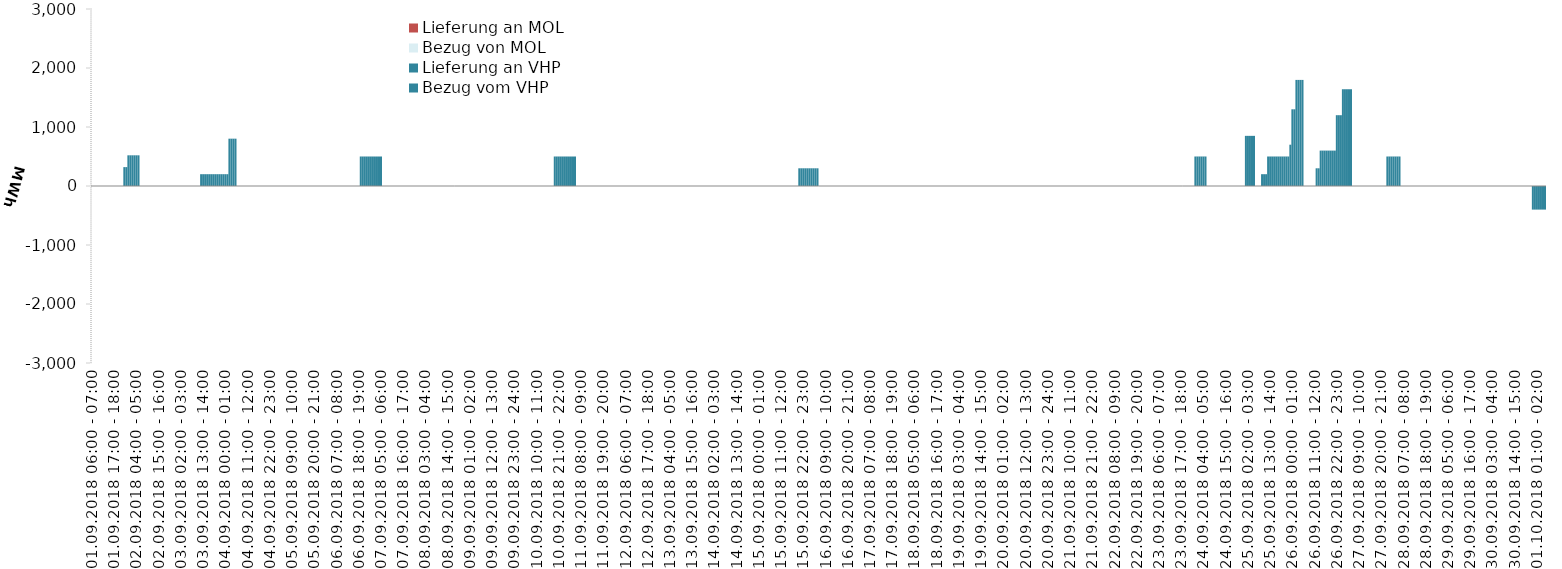
| Category | Bezug vom VHP | Lieferung an VHP | Bezug von MOL | Lieferung an MOL |
|---|---|---|---|---|
| 01.09.2018 06:00 - 07:00 | 0 | 0 | 0 | 0 |
| 01.09.2018 07:00 - 08:00 | 0 | 0 | 0 | 0 |
| 01.09.2018 08:00 - 09:00 | 0 | 0 | 0 | 0 |
| 01.09.2018 09:00 - 10:00 | 0 | 0 | 0 | 0 |
| 01.09.2018 10:00 - 11:00 | 0 | 0 | 0 | 0 |
| 01.09.2018 11:00 - 12:00 | 0 | 0 | 0 | 0 |
| 01.09.2018 12:00 - 13:00 | 0 | 0 | 0 | 0 |
| 01.09.2018 13:00 - 14:00 | 0 | 0 | 0 | 0 |
| 01.09.2018 14:00 - 15:00 | 0 | 0 | 0 | 0 |
| 01.09.2018 15:00 - 16:00 | 0 | 0 | 0 | 0 |
| 01.09.2018 16:00 - 17:00 | 0 | 0 | 0 | 0 |
| 01.09.2018 17:00 - 18:00 | 0 | 0 | 0 | 0 |
| 01.09.2018 18:00 - 19:00 | 0 | 0 | 0 | 0 |
| 01.09.2018 19:00 - 20:00 | 0 | 0 | 0 | 0 |
| 01.09.2018 20:00 - 21:00 | 0 | 0 | 0 | 0 |
| 01.09.2018 21:00 - 22:00 | 0 | 0 | 0 | 0 |
| 01.09.2018 22:00 - 23:00 | 320 | 0 | 0 | 0 |
| 01.09.2018 23:00 - 24:00 | 320 | 0 | 0 | 0 |
| 02.09.2018 00:00 - 01:00 | 520 | 0 | 0 | 0 |
| 02.09.2018 01:00 - 02:00 | 520 | 0 | 0 | 0 |
| 02.09.2018 02:00 - 03:00 | 520 | 0 | 0 | 0 |
| 02.09.2018 03:00 - 04:00 | 520 | 0 | 0 | 0 |
| 02.09.2018 04:00 - 05:00 | 520 | 0 | 0 | 0 |
| 02.09.2018 05:00 - 06:00 | 520 | 0 | 0 | 0 |
| 02.09.2018 06:00 - 07:00 | 0 | 0 | 0 | 0 |
| 02.09.2018 07:00 - 08:00 | 0 | 0 | 0 | 0 |
| 02.09.2018 08:00 - 09:00 | 0 | 0 | 0 | 0 |
| 02.09.2018 09:00 - 10:00 | 0 | 0 | 0 | 0 |
| 02.09.2018 10:00 - 11:00 | 0 | 0 | 0 | 0 |
| 02.09.2018 11:00 - 12:00 | 0 | 0 | 0 | 0 |
| 02.09.2018 12:00 - 13:00 | 0 | 0 | 0 | 0 |
| 02.09.2018 13:00 - 14:00 | 0 | 0 | 0 | 0 |
| 02.09.2018 14:00 - 15:00 | 0 | 0 | 0 | 0 |
| 02.09.2018 15:00 - 16:00 | 0 | 0 | 0 | 0 |
| 02.09.2018 16:00 - 17:00 | 0 | 0 | 0 | 0 |
| 02.09.2018 17:00 - 18:00 | 0 | 0 | 0 | 0 |
| 02.09.2018 18:00 - 19:00 | 0 | 0 | 0 | 0 |
| 02.09.2018 19:00 - 20:00 | 0 | 0 | 0 | 0 |
| 02.09.2018 20:00 - 21:00 | 0 | 0 | 0 | 0 |
| 02.09.2018 21:00 - 22:00 | 0 | 0 | 0 | 0 |
| 02.09.2018 22:00 - 23:00 | 0 | 0 | 0 | 0 |
| 02.09.2018 23:00 - 24:00 | 0 | 0 | 0 | 0 |
| 03.09.2018 00:00 - 01:00 | 0 | 0 | 0 | 0 |
| 03.09.2018 01:00 - 02:00 | 0 | 0 | 0 | 0 |
| 03.09.2018 02:00 - 03:00 | 0 | 0 | 0 | 0 |
| 03.09.2018 03:00 - 04:00 | 0 | 0 | 0 | 0 |
| 03.09.2018 04:00 - 05:00 | 0 | 0 | 0 | 0 |
| 03.09.2018 05:00 - 06:00 | 0 | 0 | 0 | 0 |
| 03.09.2018 06:00 - 07:00 | 0 | 0 | 0 | 0 |
| 03.09.2018 07:00 - 08:00 | 0 | 0 | 0 | 0 |
| 03.09.2018 08:00 - 09:00 | 0 | 0 | 0 | 0 |
| 03.09.2018 09:00 - 10:00 | 0 | 0 | 0 | 0 |
| 03.09.2018 10:00 - 11:00 | 0 | 0 | 0 | 0 |
| 03.09.2018 11:00 - 12:00 | 0 | 0 | 0 | 0 |
| 03.09.2018 12:00 - 13:00 | 200 | 0 | 0 | 0 |
| 03.09.2018 13:00 - 14:00 | 200 | 0 | 0 | 0 |
| 03.09.2018 14:00 - 15:00 | 200 | 0 | 0 | 0 |
| 03.09.2018 15:00 - 16:00 | 200 | 0 | 0 | 0 |
| 03.09.2018 16:00 - 17:00 | 200 | 0 | 0 | 0 |
| 03.09.2018 17:00 - 18:00 | 200 | 0 | 0 | 0 |
| 03.09.2018 18:00 - 19:00 | 200 | 0 | 0 | 0 |
| 03.09.2018 19:00 - 20:00 | 200 | 0 | 0 | 0 |
| 03.09.2018 20:00 - 21:00 | 200 | 0 | 0 | 0 |
| 03.09.2018 21:00 - 22:00 | 200 | 0 | 0 | 0 |
| 03.09.2018 22:00 - 23:00 | 200 | 0 | 0 | 0 |
| 03.09.2018 23:00 - 24:00 | 200 | 0 | 0 | 0 |
| 04.09.2018 00:00 - 01:00 | 200 | 0 | 0 | 0 |
| 04.09.2018 01:00 - 02:00 | 200 | 0 | 0 | 0 |
| 04.09.2018 02:00 - 03:00 | 802 | 0 | 0 | 0 |
| 04.09.2018 03:00 - 04:00 | 802 | 0 | 0 | 0 |
| 04.09.2018 04:00 - 05:00 | 802 | 0 | 0 | 0 |
| 04.09.2018 05:00 - 06:00 | 802 | 0 | 0 | 0 |
| 04.09.2018 06:00 - 07:00 | 0 | 0 | 0 | 0 |
| 04.09.2018 07:00 - 08:00 | 0 | 0 | 0 | 0 |
| 04.09.2018 08:00 - 09:00 | 0 | 0 | 0 | 0 |
| 04.09.2018 09:00 - 10:00 | 0 | 0 | 0 | 0 |
| 04.09.2018 10:00 - 11:00 | 0 | 0 | 0 | 0 |
| 04.09.2018 11:00 - 12:00 | 0 | 0 | 0 | 0 |
| 04.09.2018 12:00 - 13:00 | 0 | 0 | 0 | 0 |
| 04.09.2018 13:00 - 14:00 | 0 | 0 | 0 | 0 |
| 04.09.2018 14:00 - 15:00 | 0 | 0 | 0 | 0 |
| 04.09.2018 15:00 - 16:00 | 0 | 0 | 0 | 0 |
| 04.09.2018 16:00 - 17:00 | 0 | 0 | 0 | 0 |
| 04.09.2018 17:00 - 18:00 | 0 | 0 | 0 | 0 |
| 04.09.2018 18:00 - 19:00 | 0 | 0 | 0 | 0 |
| 04.09.2018 19:00 - 20:00 | 0 | 0 | 0 | 0 |
| 04.09.2018 20:00 - 21:00 | 0 | 0 | 0 | 0 |
| 04.09.2018 21:00 - 22:00 | 0 | 0 | 0 | 0 |
| 04.09.2018 22:00 - 23:00 | 0 | 0 | 0 | 0 |
| 04.09.2018 23:00 - 24:00 | 0 | 0 | 0 | 0 |
| 05.09.2018 00:00 - 01:00 | 0 | 0 | 0 | 0 |
| 05.09.2018 01:00 - 02:00 | 0 | 0 | 0 | 0 |
| 05.09.2018 02:00 - 03:00 | 0 | 0 | 0 | 0 |
| 05.09.2018 03:00 - 04:00 | 0 | 0 | 0 | 0 |
| 05.09.2018 04:00 - 05:00 | 0 | 0 | 0 | 0 |
| 05.09.2018 05:00 - 06:00 | 0 | 0 | 0 | 0 |
| 05.09.2018 06:00 - 07:00 | 0 | 0 | 0 | 0 |
| 05.09.2018 07:00 - 08:00 | 0 | 0 | 0 | 0 |
| 05.09.2018 08:00 - 09:00 | 0 | 0 | 0 | 0 |
| 05.09.2018 09:00 - 10:00 | 0 | 0 | 0 | 0 |
| 05.09.2018 10:00 - 11:00 | 0 | 0 | 0 | 0 |
| 05.09.2018 11:00 - 12:00 | 0 | 0 | 0 | 0 |
| 05.09.2018 12:00 - 13:00 | 0 | 0 | 0 | 0 |
| 05.09.2018 13:00 - 14:00 | 0 | 0 | 0 | 0 |
| 05.09.2018 14:00 - 15:00 | 0 | 0 | 0 | 0 |
| 05.09.2018 15:00 - 16:00 | 0 | 0 | 0 | 0 |
| 05.09.2018 16:00 - 17:00 | 0 | 0 | 0 | 0 |
| 05.09.2018 17:00 - 18:00 | 0 | 0 | 0 | 0 |
| 05.09.2018 18:00 - 19:00 | 0 | 0 | 0 | 0 |
| 05.09.2018 19:00 - 20:00 | 0 | 0 | 0 | 0 |
| 05.09.2018 20:00 - 21:00 | 0 | 0 | 0 | 0 |
| 05.09.2018 21:00 - 22:00 | 0 | 0 | 0 | 0 |
| 05.09.2018 22:00 - 23:00 | 0 | 0 | 0 | 0 |
| 05.09.2018 23:00 - 24:00 | 0 | 0 | 0 | 0 |
| 06.09.2018 00:00 - 01:00 | 0 | 0 | 0 | 0 |
| 06.09.2018 01:00 - 02:00 | 0 | 0 | 0 | 0 |
| 06.09.2018 02:00 - 03:00 | 0 | 0 | 0 | 0 |
| 06.09.2018 03:00 - 04:00 | 0 | 0 | 0 | 0 |
| 06.09.2018 04:00 - 05:00 | 0 | 0 | 0 | 0 |
| 06.09.2018 05:00 - 06:00 | 0 | 0 | 0 | 0 |
| 06.09.2018 06:00 - 07:00 | 0 | 0 | 0 | 0 |
| 06.09.2018 07:00 - 08:00 | 0 | 0 | 0 | 0 |
| 06.09.2018 08:00 - 09:00 | 0 | 0 | 0 | 0 |
| 06.09.2018 09:00 - 10:00 | 0 | 0 | 0 | 0 |
| 06.09.2018 10:00 - 11:00 | 0 | 0 | 0 | 0 |
| 06.09.2018 11:00 - 12:00 | 0 | 0 | 0 | 0 |
| 06.09.2018 12:00 - 13:00 | 0 | 0 | 0 | 0 |
| 06.09.2018 13:00 - 14:00 | 0 | 0 | 0 | 0 |
| 06.09.2018 14:00 - 15:00 | 0 | 0 | 0 | 0 |
| 06.09.2018 15:00 - 16:00 | 0 | 0 | 0 | 0 |
| 06.09.2018 16:00 - 17:00 | 0 | 0 | 0 | 0 |
| 06.09.2018 17:00 - 18:00 | 0 | 0 | 0 | 0 |
| 06.09.2018 18:00 - 19:00 | 0 | 0 | 0 | 0 |
| 06.09.2018 19:00 - 20:00 | 500 | 0 | 0 | 0 |
| 06.09.2018 20:00 - 21:00 | 500 | 0 | 0 | 0 |
| 06.09.2018 21:00 - 22:00 | 500 | 0 | 0 | 0 |
| 06.09.2018 22:00 - 23:00 | 500 | 0 | 0 | 0 |
| 06.09.2018 23:00 - 24:00 | 500 | 0 | 0 | 0 |
| 07.09.2018 00:00 - 01:00 | 500 | 0 | 0 | 0 |
| 07.09.2018 01:00 - 02:00 | 500 | 0 | 0 | 0 |
| 07.09.2018 02:00 - 03:00 | 500 | 0 | 0 | 0 |
| 07.09.2018 03:00 - 04:00 | 500 | 0 | 0 | 0 |
| 07.09.2018 04:00 - 05:00 | 500 | 0 | 0 | 0 |
| 07.09.2018 05:00 - 06:00 | 500 | 0 | 0 | 0 |
| 07.09.2018 06:00 - 07:00 | 0 | 0 | 0 | 0 |
| 07.09.2018 07:00 - 08:00 | 0 | 0 | 0 | 0 |
| 07.09.2018 08:00 - 09:00 | 0 | 0 | 0 | 0 |
| 07.09.2018 09:00 - 10:00 | 0 | 0 | 0 | 0 |
| 07.09.2018 10:00 - 11:00 | 0 | 0 | 0 | 0 |
| 07.09.2018 11:00 - 12:00 | 0 | 0 | 0 | 0 |
| 07.09.2018 12:00 - 13:00 | 0 | 0 | 0 | 0 |
| 07.09.2018 13:00 - 14:00 | 0 | 0 | 0 | 0 |
| 07.09.2018 14:00 - 15:00 | 0 | 0 | 0 | 0 |
| 07.09.2018 15:00 - 16:00 | 0 | 0 | 0 | 0 |
| 07.09.2018 16:00 - 17:00 | 0 | 0 | 0 | 0 |
| 07.09.2018 17:00 - 18:00 | 0 | 0 | 0 | 0 |
| 07.09.2018 18:00 - 19:00 | 0 | 0 | 0 | 0 |
| 07.09.2018 19:00 - 20:00 | 0 | 0 | 0 | 0 |
| 07.09.2018 20:00 - 21:00 | 0 | 0 | 0 | 0 |
| 07.09.2018 21:00 - 22:00 | 0 | 0 | 0 | 0 |
| 07.09.2018 22:00 - 23:00 | 0 | 0 | 0 | 0 |
| 07.09.2018 23:00 - 24:00 | 0 | 0 | 0 | 0 |
| 08.09.2018 00:00 - 01:00 | 0 | 0 | 0 | 0 |
| 08.09.2018 01:00 - 02:00 | 0 | 0 | 0 | 0 |
| 08.09.2018 02:00 - 03:00 | 0 | 0 | 0 | 0 |
| 08.09.2018 03:00 - 04:00 | 0 | 0 | 0 | 0 |
| 08.09.2018 04:00 - 05:00 | 0 | 0 | 0 | 0 |
| 08.09.2018 05:00 - 06:00 | 0 | 0 | 0 | 0 |
| 08.09.2018 06:00 - 07:00 | 0 | 0 | 0 | 0 |
| 08.09.2018 07:00 - 08:00 | 0 | 0 | 0 | 0 |
| 08.09.2018 08:00 - 09:00 | 0 | 0 | 0 | 0 |
| 08.09.2018 09:00 - 10:00 | 0 | 0 | 0 | 0 |
| 08.09.2018 10:00 - 11:00 | 0 | 0 | 0 | 0 |
| 08.09.2018 11:00 - 12:00 | 0 | 0 | 0 | 0 |
| 08.09.2018 12:00 - 13:00 | 0 | 0 | 0 | 0 |
| 08.09.2018 13:00 - 14:00 | 0 | 0 | 0 | 0 |
| 08.09.2018 14:00 - 15:00 | 0 | 0 | 0 | 0 |
| 08.09.2018 15:00 - 16:00 | 0 | 0 | 0 | 0 |
| 08.09.2018 16:00 - 17:00 | 0 | 0 | 0 | 0 |
| 08.09.2018 17:00 - 18:00 | 0 | 0 | 0 | 0 |
| 08.09.2018 18:00 - 19:00 | 0 | 0 | 0 | 0 |
| 08.09.2018 19:00 - 20:00 | 0 | 0 | 0 | 0 |
| 08.09.2018 20:00 - 21:00 | 0 | 0 | 0 | 0 |
| 08.09.2018 21:00 - 22:00 | 0 | 0 | 0 | 0 |
| 08.09.2018 22:00 - 23:00 | 0 | 0 | 0 | 0 |
| 08.09.2018 23:00 - 24:00 | 0 | 0 | 0 | 0 |
| 09.09.2018 00:00 - 01:00 | 0 | 0 | 0 | 0 |
| 09.09.2018 01:00 - 02:00 | 0 | 0 | 0 | 0 |
| 09.09.2018 02:00 - 03:00 | 0 | 0 | 0 | 0 |
| 09.09.2018 03:00 - 04:00 | 0 | 0 | 0 | 0 |
| 09.09.2018 04:00 - 05:00 | 0 | 0 | 0 | 0 |
| 09.09.2018 05:00 - 06:00 | 0 | 0 | 0 | 0 |
| 09.09.2018 06:00 - 07:00 | 0 | 0 | 0 | 0 |
| 09.09.2018 07:00 - 08:00 | 0 | 0 | 0 | 0 |
| 09.09.2018 08:00 - 09:00 | 0 | 0 | 0 | 0 |
| 09.09.2018 09:00 - 10:00 | 0 | 0 | 0 | 0 |
| 09.09.2018 10:00 - 11:00 | 0 | 0 | 0 | 0 |
| 09.09.2018 11:00 - 12:00 | 0 | 0 | 0 | 0 |
| 09.09.2018 12:00 - 13:00 | 0 | 0 | 0 | 0 |
| 09.09.2018 13:00 - 14:00 | 0 | 0 | 0 | 0 |
| 09.09.2018 14:00 - 15:00 | 0 | 0 | 0 | 0 |
| 09.09.2018 15:00 - 16:00 | 0 | 0 | 0 | 0 |
| 09.09.2018 16:00 - 17:00 | 0 | 0 | 0 | 0 |
| 09.09.2018 17:00 - 18:00 | 0 | 0 | 0 | 0 |
| 09.09.2018 18:00 - 19:00 | 0 | 0 | 0 | 0 |
| 09.09.2018 19:00 - 20:00 | 0 | 0 | 0 | 0 |
| 09.09.2018 20:00 - 21:00 | 0 | 0 | 0 | 0 |
| 09.09.2018 21:00 - 22:00 | 0 | 0 | 0 | 0 |
| 09.09.2018 22:00 - 23:00 | 0 | 0 | 0 | 0 |
| 09.09.2018 23:00 - 24:00 | 0 | 0 | 0 | 0 |
| 10.09.2018 00:00 - 01:00 | 0 | 0 | 0 | 0 |
| 10.09.2018 01:00 - 02:00 | 0 | 0 | 0 | 0 |
| 10.09.2018 02:00 - 03:00 | 0 | 0 | 0 | 0 |
| 10.09.2018 03:00 - 04:00 | 0 | 0 | 0 | 0 |
| 10.09.2018 04:00 - 05:00 | 0 | 0 | 0 | 0 |
| 10.09.2018 05:00 - 06:00 | 0 | 0 | 0 | 0 |
| 10.09.2018 06:00 - 07:00 | 0 | 0 | 0 | 0 |
| 10.09.2018 07:00 - 08:00 | 0 | 0 | 0 | 0 |
| 10.09.2018 08:00 - 09:00 | 0 | 0 | 0 | 0 |
| 10.09.2018 09:00 - 10:00 | 0 | 0 | 0 | 0 |
| 10.09.2018 10:00 - 11:00 | 0 | 0 | 0 | 0 |
| 10.09.2018 11:00 - 12:00 | 0 | 0 | 0 | 0 |
| 10.09.2018 12:00 - 13:00 | 0 | 0 | 0 | 0 |
| 10.09.2018 13:00 - 14:00 | 0 | 0 | 0 | 0 |
| 10.09.2018 14:00 - 15:00 | 0 | 0 | 0 | 0 |
| 10.09.2018 15:00 - 16:00 | 0 | 0 | 0 | 0 |
| 10.09.2018 16:00 - 17:00 | 0 | 0 | 0 | 0 |
| 10.09.2018 17:00 - 18:00 | 0 | 0 | 0 | 0 |
| 10.09.2018 18:00 - 19:00 | 0 | 0 | 0 | 0 |
| 10.09.2018 19:00 - 20:00 | 500 | 0 | 0 | 0 |
| 10.09.2018 20:00 - 21:00 | 500 | 0 | 0 | 0 |
| 10.09.2018 21:00 - 22:00 | 500 | 0 | 0 | 0 |
| 10.09.2018 22:00 - 23:00 | 500 | 0 | 0 | 0 |
| 10.09.2018 23:00 - 24:00 | 500 | 0 | 0 | 0 |
| 11.09.2018 00:00 - 01:00 | 500 | 0 | 0 | 0 |
| 11.09.2018 01:00 - 02:00 | 500 | 0 | 0 | 0 |
| 11.09.2018 02:00 - 03:00 | 500 | 0 | 0 | 0 |
| 11.09.2018 03:00 - 04:00 | 500 | 0 | 0 | 0 |
| 11.09.2018 04:00 - 05:00 | 500 | 0 | 0 | 0 |
| 11.09.2018 05:00 - 06:00 | 500 | 0 | 0 | 0 |
| 11.09.2018 06:00 - 07:00 | 0 | 0 | 0 | 0 |
| 11.09.2018 07:00 - 08:00 | 0 | 0 | 0 | 0 |
| 11.09.2018 08:00 - 09:00 | 0 | 0 | 0 | 0 |
| 11.09.2018 09:00 - 10:00 | 0 | 0 | 0 | 0 |
| 11.09.2018 10:00 - 11:00 | 0 | 0 | 0 | 0 |
| 11.09.2018 11:00 - 12:00 | 0 | 0 | 0 | 0 |
| 11.09.2018 12:00 - 13:00 | 0 | 0 | 0 | 0 |
| 11.09.2018 13:00 - 14:00 | 0 | 0 | 0 | 0 |
| 11.09.2018 14:00 - 15:00 | 0 | 0 | 0 | 0 |
| 11.09.2018 15:00 - 16:00 | 0 | 0 | 0 | 0 |
| 11.09.2018 16:00 - 17:00 | 0 | 0 | 0 | 0 |
| 11.09.2018 17:00 - 18:00 | 0 | 0 | 0 | 0 |
| 11.09.2018 18:00 - 19:00 | 0 | 0 | 0 | 0 |
| 11.09.2018 19:00 - 20:00 | 0 | 0 | 0 | 0 |
| 11.09.2018 20:00 - 21:00 | 0 | 0 | 0 | 0 |
| 11.09.2018 21:00 - 22:00 | 0 | 0 | 0 | 0 |
| 11.09.2018 22:00 - 23:00 | 0 | 0 | 0 | 0 |
| 11.09.2018 23:00 - 24:00 | 0 | 0 | 0 | 0 |
| 12.09.2018 00:00 - 01:00 | 0 | 0 | 0 | 0 |
| 12.09.2018 01:00 - 02:00 | 0 | 0 | 0 | 0 |
| 12.09.2018 02:00 - 03:00 | 0 | 0 | 0 | 0 |
| 12.09.2018 03:00 - 04:00 | 0 | 0 | 0 | 0 |
| 12.09.2018 04:00 - 05:00 | 0 | 0 | 0 | 0 |
| 12.09.2018 05:00 - 06:00 | 0 | 0 | 0 | 0 |
| 12.09.2018 06:00 - 07:00 | 0 | 0 | 0 | 0 |
| 12.09.2018 07:00 - 08:00 | 0 | 0 | 0 | 0 |
| 12.09.2018 08:00 - 09:00 | 0 | 0 | 0 | 0 |
| 12.09.2018 09:00 - 10:00 | 0 | 0 | 0 | 0 |
| 12.09.2018 10:00 - 11:00 | 0 | 0 | 0 | 0 |
| 12.09.2018 11:00 - 12:00 | 0 | 0 | 0 | 0 |
| 12.09.2018 12:00 - 13:00 | 0 | 0 | 0 | 0 |
| 12.09.2018 13:00 - 14:00 | 0 | 0 | 0 | 0 |
| 12.09.2018 14:00 - 15:00 | 0 | 0 | 0 | 0 |
| 12.09.2018 15:00 - 16:00 | 0 | 0 | 0 | 0 |
| 12.09.2018 16:00 - 17:00 | 0 | 0 | 0 | 0 |
| 12.09.2018 17:00 - 18:00 | 0 | 0 | 0 | 0 |
| 12.09.2018 18:00 - 19:00 | 0 | 0 | 0 | 0 |
| 12.09.2018 19:00 - 20:00 | 0 | 0 | 0 | 0 |
| 12.09.2018 20:00 - 21:00 | 0 | 0 | 0 | 0 |
| 12.09.2018 21:00 - 22:00 | 0 | 0 | 0 | 0 |
| 12.09.2018 22:00 - 23:00 | 0 | 0 | 0 | 0 |
| 12.09.2018 23:00 - 24:00 | 0 | 0 | 0 | 0 |
| 13.09.2018 00:00 - 01:00 | 0 | 0 | 0 | 0 |
| 13.09.2018 01:00 - 02:00 | 0 | 0 | 0 | 0 |
| 13.09.2018 02:00 - 03:00 | 0 | 0 | 0 | 0 |
| 13.09.2018 03:00 - 04:00 | 0 | 0 | 0 | 0 |
| 13.09.2018 04:00 - 05:00 | 0 | 0 | 0 | 0 |
| 13.09.2018 05:00 - 06:00 | 0 | 0 | 0 | 0 |
| 13.09.2018 06:00 - 07:00 | 0 | 0 | 0 | 0 |
| 13.09.2018 07:00 - 08:00 | 0 | 0 | 0 | 0 |
| 13.09.2018 08:00 - 09:00 | 0 | 0 | 0 | 0 |
| 13.09.2018 09:00 - 10:00 | 0 | 0 | 0 | 0 |
| 13.09.2018 10:00 - 11:00 | 0 | 0 | 0 | 0 |
| 13.09.2018 11:00 - 12:00 | 0 | 0 | 0 | 0 |
| 13.09.2018 12:00 - 13:00 | 0 | 0 | 0 | 0 |
| 13.09.2018 13:00 - 14:00 | 0 | 0 | 0 | 0 |
| 13.09.2018 14:00 - 15:00 | 0 | 0 | 0 | 0 |
| 13.09.2018 15:00 - 16:00 | 0 | 0 | 0 | 0 |
| 13.09.2018 16:00 - 17:00 | 0 | 0 | 0 | 0 |
| 13.09.2018 17:00 - 18:00 | 0 | 0 | 0 | 0 |
| 13.09.2018 18:00 - 19:00 | 0 | 0 | 0 | 0 |
| 13.09.2018 19:00 - 20:00 | 0 | 0 | 0 | 0 |
| 13.09.2018 20:00 - 21:00 | 0 | 0 | 0 | 0 |
| 13.09.2018 21:00 - 22:00 | 0 | 0 | 0 | 0 |
| 13.09.2018 22:00 - 23:00 | 0 | 0 | 0 | 0 |
| 13.09.2018 23:00 - 24:00 | 0 | 0 | 0 | 0 |
| 14.09.2018 00:00 - 01:00 | 0 | 0 | 0 | 0 |
| 14.09.2018 01:00 - 02:00 | 0 | 0 | 0 | 0 |
| 14.09.2018 02:00 - 03:00 | 0 | 0 | 0 | 0 |
| 14.09.2018 03:00 - 04:00 | 0 | 0 | 0 | 0 |
| 14.09.2018 04:00 - 05:00 | 0 | 0 | 0 | 0 |
| 14.09.2018 05:00 - 06:00 | 0 | 0 | 0 | 0 |
| 14.09.2018 06:00 - 07:00 | 0 | 0 | 0 | 0 |
| 14.09.2018 07:00 - 08:00 | 0 | 0 | 0 | 0 |
| 14.09.2018 08:00 - 09:00 | 0 | 0 | 0 | 0 |
| 14.09.2018 09:00 - 10:00 | 0 | 0 | 0 | 0 |
| 14.09.2018 10:00 - 11:00 | 0 | 0 | 0 | 0 |
| 14.09.2018 11:00 - 12:00 | 0 | 0 | 0 | 0 |
| 14.09.2018 12:00 - 13:00 | 0 | 0 | 0 | 0 |
| 14.09.2018 13:00 - 14:00 | 0 | 0 | 0 | 0 |
| 14.09.2018 14:00 - 15:00 | 0 | 0 | 0 | 0 |
| 14.09.2018 15:00 - 16:00 | 0 | 0 | 0 | 0 |
| 14.09.2018 16:00 - 17:00 | 0 | 0 | 0 | 0 |
| 14.09.2018 17:00 - 18:00 | 0 | 0 | 0 | 0 |
| 14.09.2018 18:00 - 19:00 | 0 | 0 | 0 | 0 |
| 14.09.2018 19:00 - 20:00 | 0 | 0 | 0 | 0 |
| 14.09.2018 20:00 - 21:00 | 0 | 0 | 0 | 0 |
| 14.09.2018 21:00 - 22:00 | 0 | 0 | 0 | 0 |
| 14.09.2018 22:00 - 23:00 | 0 | 0 | 0 | 0 |
| 14.09.2018 23:00 - 24:00 | 0 | 0 | 0 | 0 |
| 15.09.2018 00:00 - 01:00 | 0 | 0 | 0 | 0 |
| 15.09.2018 01:00 - 02:00 | 0 | 0 | 0 | 0 |
| 15.09.2018 02:00 - 03:00 | 0 | 0 | 0 | 0 |
| 15.09.2018 03:00 - 04:00 | 0 | 0 | 0 | 0 |
| 15.09.2018 04:00 - 05:00 | 0 | 0 | 0 | 0 |
| 15.09.2018 05:00 - 06:00 | 0 | 0 | 0 | 0 |
| 15.09.2018 06:00 - 07:00 | 0 | 0 | 0 | 0 |
| 15.09.2018 07:00 - 08:00 | 0 | 0 | 0 | 0 |
| 15.09.2018 08:00 - 09:00 | 0 | 0 | 0 | 0 |
| 15.09.2018 09:00 - 10:00 | 0 | 0 | 0 | 0 |
| 15.09.2018 10:00 - 11:00 | 0 | 0 | 0 | 0 |
| 15.09.2018 11:00 - 12:00 | 0 | 0 | 0 | 0 |
| 15.09.2018 12:00 - 13:00 | 0 | 0 | 0 | 0 |
| 15.09.2018 13:00 - 14:00 | 0 | 0 | 0 | 0 |
| 15.09.2018 14:00 - 15:00 | 0 | 0 | 0 | 0 |
| 15.09.2018 15:00 - 16:00 | 0 | 0 | 0 | 0 |
| 15.09.2018 16:00 - 17:00 | 0 | 0 | 0 | 0 |
| 15.09.2018 17:00 - 18:00 | 0 | 0 | 0 | 0 |
| 15.09.2018 18:00 - 19:00 | 0 | 0 | 0 | 0 |
| 15.09.2018 19:00 - 20:00 | 0 | 0 | 0 | 0 |
| 15.09.2018 20:00 - 21:00 | 300 | 0 | 0 | 0 |
| 15.09.2018 21:00 - 22:00 | 300 | 0 | 0 | 0 |
| 15.09.2018 22:00 - 23:00 | 300 | 0 | 0 | 0 |
| 15.09.2018 23:00 - 24:00 | 300 | 0 | 0 | 0 |
| 16.09.2018 00:00 - 01:00 | 300 | 0 | 0 | 0 |
| 16.09.2018 01:00 - 02:00 | 300 | 0 | 0 | 0 |
| 16.09.2018 02:00 - 03:00 | 300 | 0 | 0 | 0 |
| 16.09.2018 03:00 - 04:00 | 300 | 0 | 0 | 0 |
| 16.09.2018 04:00 - 05:00 | 300 | 0 | 0 | 0 |
| 16.09.2018 05:00 - 06:00 | 300 | 0 | 0 | 0 |
| 16.09.2018 06:00 - 07:00 | 0 | 0 | 0 | 0 |
| 16.09.2018 07:00 - 08:00 | 0 | 0 | 0 | 0 |
| 16.09.2018 08:00 - 09:00 | 0 | 0 | 0 | 0 |
| 16.09.2018 09:00 - 10:00 | 0 | 0 | 0 | 0 |
| 16.09.2018 10:00 - 11:00 | 0 | 0 | 0 | 0 |
| 16.09.2018 11:00 - 12:00 | 0 | 0 | 0 | 0 |
| 16.09.2018 12:00 - 13:00 | 0 | 0 | 0 | 0 |
| 16.09.2018 13:00 - 14:00 | 0 | 0 | 0 | 0 |
| 16.09.2018 14:00 - 15:00 | 0 | 0 | 0 | 0 |
| 16.09.2018 15:00 - 16:00 | 0 | 0 | 0 | 0 |
| 16.09.2018 16:00 - 17:00 | 0 | 0 | 0 | 0 |
| 16.09.2018 17:00 - 18:00 | 0 | 0 | 0 | 0 |
| 16.09.2018 18:00 - 19:00 | 0 | 0 | 0 | 0 |
| 16.09.2018 19:00 - 20:00 | 0 | 0 | 0 | 0 |
| 16.09.2018 20:00 - 21:00 | 0 | 0 | 0 | 0 |
| 16.09.2018 21:00 - 22:00 | 0 | 0 | 0 | 0 |
| 16.09.2018 22:00 - 23:00 | 0 | 0 | 0 | 0 |
| 16.09.2018 23:00 - 24:00 | 0 | 0 | 0 | 0 |
| 17.09.2018 00:00 - 01:00 | 0 | 0 | 0 | 0 |
| 17.09.2018 01:00 - 02:00 | 0 | 0 | 0 | 0 |
| 17.09.2018 02:00 - 03:00 | 0 | 0 | 0 | 0 |
| 17.09.2018 03:00 - 04:00 | 0 | 0 | 0 | 0 |
| 17.09.2018 04:00 - 05:00 | 0 | 0 | 0 | 0 |
| 17.09.2018 05:00 - 06:00 | 0 | 0 | 0 | 0 |
| 17.09.2018 06:00 - 07:00 | 0 | 0 | 0 | 0 |
| 17.09.2018 07:00 - 08:00 | 0 | 0 | 0 | 0 |
| 17.09.2018 08:00 - 09:00 | 0 | 0 | 0 | 0 |
| 17.09.2018 09:00 - 10:00 | 0 | 0 | 0 | 0 |
| 17.09.2018 10:00 - 11:00 | 0 | 0 | 0 | 0 |
| 17.09.2018 11:00 - 12:00 | 0 | 0 | 0 | 0 |
| 17.09.2018 12:00 - 13:00 | 0 | 0 | 0 | 0 |
| 17.09.2018 13:00 - 14:00 | 0 | 0 | 0 | 0 |
| 17.09.2018 14:00 - 15:00 | 0 | 0 | 0 | 0 |
| 17.09.2018 15:00 - 16:00 | 0 | 0 | 0 | 0 |
| 17.09.2018 16:00 - 17:00 | 0 | 0 | 0 | 0 |
| 17.09.2018 17:00 - 18:00 | 0 | 0 | 0 | 0 |
| 17.09.2018 18:00 - 19:00 | 0 | 0 | 0 | 0 |
| 17.09.2018 19:00 - 20:00 | 0 | 0 | 0 | 0 |
| 17.09.2018 20:00 - 21:00 | 0 | 0 | 0 | 0 |
| 17.09.2018 21:00 - 22:00 | 0 | 0 | 0 | 0 |
| 17.09.2018 22:00 - 23:00 | 0 | 0 | 0 | 0 |
| 17.09.2018 23:00 - 24:00 | 0 | 0 | 0 | 0 |
| 18.09.2018 00:00 - 01:00 | 0 | 0 | 0 | 0 |
| 18.09.2018 01:00 - 02:00 | 0 | 0 | 0 | 0 |
| 18.09.2018 02:00 - 03:00 | 0 | 0 | 0 | 0 |
| 18.09.2018 03:00 - 04:00 | 0 | 0 | 0 | 0 |
| 18.09.2018 04:00 - 05:00 | 0 | 0 | 0 | 0 |
| 18.09.2018 05:00 - 06:00 | 0 | 0 | 0 | 0 |
| 18.09.2018 06:00 - 07:00 | 0 | 0 | 0 | 0 |
| 18.09.2018 07:00 - 08:00 | 0 | 0 | 0 | 0 |
| 18.09.2018 08:00 - 09:00 | 0 | 0 | 0 | 0 |
| 18.09.2018 09:00 - 10:00 | 0 | 0 | 0 | 0 |
| 18.09.2018 10:00 - 11:00 | 0 | 0 | 0 | 0 |
| 18.09.2018 11:00 - 12:00 | 0 | 0 | 0 | 0 |
| 18.09.2018 12:00 - 13:00 | 0 | 0 | 0 | 0 |
| 18.09.2018 13:00 - 14:00 | 0 | 0 | 0 | 0 |
| 18.09.2018 14:00 - 15:00 | 0 | 0 | 0 | 0 |
| 18.09.2018 15:00 - 16:00 | 0 | 0 | 0 | 0 |
| 18.09.2018 16:00 - 17:00 | 0 | 0 | 0 | 0 |
| 18.09.2018 17:00 - 18:00 | 0 | 0 | 0 | 0 |
| 18.09.2018 18:00 - 19:00 | 0 | 0 | 0 | 0 |
| 18.09.2018 19:00 - 20:00 | 0 | 0 | 0 | 0 |
| 18.09.2018 20:00 - 21:00 | 0 | 0 | 0 | 0 |
| 18.09.2018 21:00 - 22:00 | 0 | 0 | 0 | 0 |
| 18.09.2018 22:00 - 23:00 | 0 | 0 | 0 | 0 |
| 18.09.2018 23:00 - 24:00 | 0 | 0 | 0 | 0 |
| 19.09.2018 00:00 - 01:00 | 0 | 0 | 0 | 0 |
| 19.09.2018 01:00 - 02:00 | 0 | 0 | 0 | 0 |
| 19.09.2018 02:00 - 03:00 | 0 | 0 | 0 | 0 |
| 19.09.2018 03:00 - 04:00 | 0 | 0 | 0 | 0 |
| 19.09.2018 04:00 - 05:00 | 0 | 0 | 0 | 0 |
| 19.09.2018 05:00 - 06:00 | 0 | 0 | 0 | 0 |
| 19.09.2018 06:00 - 07:00 | 0 | 0 | 0 | 0 |
| 19.09.2018 07:00 - 08:00 | 0 | 0 | 0 | 0 |
| 19.09.2018 08:00 - 09:00 | 0 | 0 | 0 | 0 |
| 19.09.2018 09:00 - 10:00 | 0 | 0 | 0 | 0 |
| 19.09.2018 10:00 - 11:00 | 0 | 0 | 0 | 0 |
| 19.09.2018 11:00 - 12:00 | 0 | 0 | 0 | 0 |
| 19.09.2018 12:00 - 13:00 | 0 | 0 | 0 | 0 |
| 19.09.2018 13:00 - 14:00 | 0 | 0 | 0 | 0 |
| 19.09.2018 14:00 - 15:00 | 0 | 0 | 0 | 0 |
| 19.09.2018 15:00 - 16:00 | 0 | 0 | 0 | 0 |
| 19.09.2018 16:00 - 17:00 | 0 | 0 | 0 | 0 |
| 19.09.2018 17:00 - 18:00 | 0 | 0 | 0 | 0 |
| 19.09.2018 18:00 - 19:00 | 0 | 0 | 0 | 0 |
| 19.09.2018 19:00 - 20:00 | 0 | 0 | 0 | 0 |
| 19.09.2018 20:00 - 21:00 | 0 | 0 | 0 | 0 |
| 19.09.2018 21:00 - 22:00 | 0 | 0 | 0 | 0 |
| 19.09.2018 22:00 - 23:00 | 0 | 0 | 0 | 0 |
| 19.09.2018 23:00 - 24:00 | 0 | 0 | 0 | 0 |
| 20.09.2018 00:00 - 01:00 | 0 | 0 | 0 | 0 |
| 20.09.2018 01:00 - 02:00 | 0 | 0 | 0 | 0 |
| 20.09.2018 02:00 - 03:00 | 0 | 0 | 0 | 0 |
| 20.09.2018 03:00 - 04:00 | 0 | 0 | 0 | 0 |
| 20.09.2018 04:00 - 05:00 | 0 | 0 | 0 | 0 |
| 20.09.2018 05:00 - 06:00 | 0 | 0 | 0 | 0 |
| 20.09.2018 06:00 - 07:00 | 0 | 0 | 0 | 0 |
| 20.09.2018 07:00 - 08:00 | 0 | 0 | 0 | 0 |
| 20.09.2018 08:00 - 09:00 | 0 | 0 | 0 | 0 |
| 20.09.2018 09:00 - 10:00 | 0 | 0 | 0 | 0 |
| 20.09.2018 10:00 - 11:00 | 0 | 0 | 0 | 0 |
| 20.09.2018 11:00 - 12:00 | 0 | 0 | 0 | 0 |
| 20.09.2018 12:00 - 13:00 | 0 | 0 | 0 | 0 |
| 20.09.2018 13:00 - 14:00 | 0 | 0 | 0 | 0 |
| 20.09.2018 14:00 - 15:00 | 0 | 0 | 0 | 0 |
| 20.09.2018 15:00 - 16:00 | 0 | 0 | 0 | 0 |
| 20.09.2018 16:00 - 17:00 | 0 | 0 | 0 | 0 |
| 20.09.2018 17:00 - 18:00 | 0 | 0 | 0 | 0 |
| 20.09.2018 18:00 - 19:00 | 0 | 0 | 0 | 0 |
| 20.09.2018 19:00 - 20:00 | 0 | 0 | 0 | 0 |
| 20.09.2018 20:00 - 21:00 | 0 | 0 | 0 | 0 |
| 20.09.2018 21:00 - 22:00 | 0 | 0 | 0 | 0 |
| 20.09.2018 22:00 - 23:00 | 0 | 0 | 0 | 0 |
| 20.09.2018 23:00 - 24:00 | 0 | 0 | 0 | 0 |
| 21.09.2018 00:00 - 01:00 | 0 | 0 | 0 | 0 |
| 21.09.2018 01:00 - 02:00 | 0 | 0 | 0 | 0 |
| 21.09.2018 02:00 - 03:00 | 0 | 0 | 0 | 0 |
| 21.09.2018 03:00 - 04:00 | 0 | 0 | 0 | 0 |
| 21.09.2018 04:00 - 05:00 | 0 | 0 | 0 | 0 |
| 21.09.2018 05:00 - 06:00 | 0 | 0 | 0 | 0 |
| 21.09.2018 06:00 - 07:00 | 0 | 0 | 0 | 0 |
| 21.09.2018 07:00 - 08:00 | 0 | 0 | 0 | 0 |
| 21.09.2018 08:00 - 09:00 | 0 | 0 | 0 | 0 |
| 21.09.2018 09:00 - 10:00 | 0 | 0 | 0 | 0 |
| 21.09.2018 10:00 - 11:00 | 0 | 0 | 0 | 0 |
| 21.09.2018 11:00 - 12:00 | 0 | 0 | 0 | 0 |
| 21.09.2018 12:00 - 13:00 | 0 | 0 | 0 | 0 |
| 21.09.2018 13:00 - 14:00 | 0 | 0 | 0 | 0 |
| 21.09.2018 14:00 - 15:00 | 0 | 0 | 0 | 0 |
| 21.09.2018 15:00 - 16:00 | 0 | 0 | 0 | 0 |
| 21.09.2018 16:00 - 17:00 | 0 | 0 | 0 | 0 |
| 21.09.2018 17:00 - 18:00 | 0 | 0 | 0 | 0 |
| 21.09.2018 18:00 - 19:00 | 0 | 0 | 0 | 0 |
| 21.09.2018 19:00 - 20:00 | 0 | 0 | 0 | 0 |
| 21.09.2018 20:00 - 21:00 | 0 | 0 | 0 | 0 |
| 21.09.2018 21:00 - 22:00 | 0 | 0 | 0 | 0 |
| 21.09.2018 22:00 - 23:00 | 0 | 0 | 0 | 0 |
| 21.09.2018 23:00 - 24:00 | 0 | 0 | 0 | 0 |
| 22.09.2018 00:00 - 01:00 | 0 | 0 | 0 | 0 |
| 22.09.2018 01:00 - 02:00 | 0 | 0 | 0 | 0 |
| 22.09.2018 02:00 - 03:00 | 0 | 0 | 0 | 0 |
| 22.09.2018 03:00 - 04:00 | 0 | 0 | 0 | 0 |
| 22.09.2018 04:00 - 05:00 | 0 | 0 | 0 | 0 |
| 22.09.2018 05:00 - 06:00 | 0 | 0 | 0 | 0 |
| 22.09.2018 06:00 - 07:00 | 0 | 0 | 0 | 0 |
| 22.09.2018 07:00 - 08:00 | 0 | 0 | 0 | 0 |
| 22.09.2018 08:00 - 09:00 | 0 | 0 | 0 | 0 |
| 22.09.2018 09:00 - 10:00 | 0 | 0 | 0 | 0 |
| 22.09.2018 10:00 - 11:00 | 0 | 0 | 0 | 0 |
| 22.09.2018 11:00 - 12:00 | 0 | 0 | 0 | 0 |
| 22.09.2018 12:00 - 13:00 | 0 | 0 | 0 | 0 |
| 22.09.2018 13:00 - 14:00 | 0 | 0 | 0 | 0 |
| 22.09.2018 14:00 - 15:00 | 0 | 0 | 0 | 0 |
| 22.09.2018 15:00 - 16:00 | 0 | 0 | 0 | 0 |
| 22.09.2018 16:00 - 17:00 | 0 | 0 | 0 | 0 |
| 22.09.2018 17:00 - 18:00 | 0 | 0 | 0 | 0 |
| 22.09.2018 18:00 - 19:00 | 0 | 0 | 0 | 0 |
| 22.09.2018 19:00 - 20:00 | 0 | 0 | 0 | 0 |
| 22.09.2018 20:00 - 21:00 | 0 | 0 | 0 | 0 |
| 22.09.2018 21:00 - 22:00 | 0 | 0 | 0 | 0 |
| 22.09.2018 22:00 - 23:00 | 0 | 0 | 0 | 0 |
| 22.09.2018 23:00 - 24:00 | 0 | 0 | 0 | 0 |
| 23.09.2018 00:00 - 01:00 | 0 | 0 | 0 | 0 |
| 23.09.2018 01:00 - 02:00 | 0 | 0 | 0 | 0 |
| 23.09.2018 02:00 - 03:00 | 0 | 0 | 0 | 0 |
| 23.09.2018 03:00 - 04:00 | 0 | 0 | 0 | 0 |
| 23.09.2018 04:00 - 05:00 | 0 | 0 | 0 | 0 |
| 23.09.2018 05:00 - 06:00 | 0 | 0 | 0 | 0 |
| 23.09.2018 06:00 - 07:00 | 0 | 0 | 0 | 0 |
| 23.09.2018 07:00 - 08:00 | 0 | 0 | 0 | 0 |
| 23.09.2018 08:00 - 09:00 | 0 | 0 | 0 | 0 |
| 23.09.2018 09:00 - 10:00 | 0 | 0 | 0 | 0 |
| 23.09.2018 10:00 - 11:00 | 0 | 0 | 0 | 0 |
| 23.09.2018 11:00 - 12:00 | 0 | 0 | 0 | 0 |
| 23.09.2018 12:00 - 13:00 | 0 | 0 | 0 | 0 |
| 23.09.2018 13:00 - 14:00 | 0 | 0 | 0 | 0 |
| 23.09.2018 14:00 - 15:00 | 0 | 0 | 0 | 0 |
| 23.09.2018 15:00 - 16:00 | 0 | 0 | 0 | 0 |
| 23.09.2018 16:00 - 17:00 | 0 | 0 | 0 | 0 |
| 23.09.2018 17:00 - 18:00 | 0 | 0 | 0 | 0 |
| 23.09.2018 18:00 - 19:00 | 0 | 0 | 0 | 0 |
| 23.09.2018 19:00 - 20:00 | 0 | 0 | 0 | 0 |
| 23.09.2018 20:00 - 21:00 | 0 | 0 | 0 | 0 |
| 23.09.2018 21:00 - 22:00 | 0 | 0 | 0 | 0 |
| 23.09.2018 22:00 - 23:00 | 0 | 0 | 0 | 0 |
| 23.09.2018 23:00 - 24:00 | 0 | 0 | 0 | 0 |
| 24.09.2018 00:00 - 01:00 | 500 | 0 | 0 | 0 |
| 24.09.2018 01:00 - 02:00 | 500 | 0 | 0 | 0 |
| 24.09.2018 02:00 - 03:00 | 500 | 0 | 0 | 0 |
| 24.09.2018 03:00 - 04:00 | 500 | 0 | 0 | 0 |
| 24.09.2018 04:00 - 05:00 | 500 | 0 | 0 | 0 |
| 24.09.2018 05:00 - 06:00 | 500 | 0 | 0 | 0 |
| 24.09.2018 06:00 - 07:00 | 0 | 0 | 0 | 0 |
| 24.09.2018 07:00 - 08:00 | 0 | 0 | 0 | 0 |
| 24.09.2018 08:00 - 09:00 | 0 | 0 | 0 | 0 |
| 24.09.2018 09:00 - 10:00 | 0 | 0 | 0 | 0 |
| 24.09.2018 10:00 - 11:00 | 0 | 0 | 0 | 0 |
| 24.09.2018 11:00 - 12:00 | 0 | 0 | 0 | 0 |
| 24.09.2018 12:00 - 13:00 | 0 | 0 | 0 | 0 |
| 24.09.2018 13:00 - 14:00 | 0 | 0 | 0 | 0 |
| 24.09.2018 14:00 - 15:00 | 0 | 0 | 0 | 0 |
| 24.09.2018 15:00 - 16:00 | 0 | 0 | 0 | 0 |
| 24.09.2018 16:00 - 17:00 | 0 | 0 | 0 | 0 |
| 24.09.2018 17:00 - 18:00 | 0 | 0 | 0 | 0 |
| 24.09.2018 18:00 - 19:00 | 0 | 0 | 0 | 0 |
| 24.09.2018 19:00 - 20:00 | 0 | 0 | 0 | 0 |
| 24.09.2018 20:00 - 21:00 | 0 | 0 | 0 | 0 |
| 24.09.2018 21:00 - 22:00 | 0 | 0 | 0 | 0 |
| 24.09.2018 22:00 - 23:00 | 0 | 0 | 0 | 0 |
| 24.09.2018 23:00 - 24:00 | 0 | 0 | 0 | 0 |
| 25.09.2018 00:00 - 01:00 | 0 | 0 | 0 | 0 |
| 25.09.2018 01:00 - 02:00 | 850 | 0 | 0 | 0 |
| 25.09.2018 02:00 - 03:00 | 850 | 0 | 0 | 0 |
| 25.09.2018 03:00 - 04:00 | 850 | 0 | 0 | 0 |
| 25.09.2018 04:00 - 05:00 | 850 | 0 | 0 | 0 |
| 25.09.2018 05:00 - 06:00 | 850 | 0 | 0 | 0 |
| 25.09.2018 06:00 - 07:00 | 0 | 0 | 0 | 0 |
| 25.09.2018 07:00 - 08:00 | 0 | 0 | 0 | 0 |
| 25.09.2018 08:00 - 09:00 | 0 | 0 | 0 | 0 |
| 25.09.2018 09:00 - 10:00 | 200 | 0 | 0 | 0 |
| 25.09.2018 10:00 - 11:00 | 200 | 0 | 0 | 0 |
| 25.09.2018 11:00 - 12:00 | 200 | 0 | 0 | 0 |
| 25.09.2018 12:00 - 13:00 | 500 | 0 | 0 | 0 |
| 25.09.2018 13:00 - 14:00 | 500 | 0 | 0 | 0 |
| 25.09.2018 14:00 - 15:00 | 500 | 0 | 0 | 0 |
| 25.09.2018 15:00 - 16:00 | 500 | 0 | 0 | 0 |
| 25.09.2018 16:00 - 17:00 | 500 | 0 | 0 | 0 |
| 25.09.2018 17:00 - 18:00 | 500 | 0 | 0 | 0 |
| 25.09.2018 18:00 - 19:00 | 500 | 0 | 0 | 0 |
| 25.09.2018 19:00 - 20:00 | 500 | 0 | 0 | 0 |
| 25.09.2018 20:00 - 21:00 | 500 | 0 | 0 | 0 |
| 25.09.2018 21:00 - 22:00 | 500 | 0 | 0 | 0 |
| 25.09.2018 22:00 - 23:00 | 500 | 0 | 0 | 0 |
| 25.09.2018 23:00 - 24:00 | 700 | 0 | 0 | 0 |
| 26.09.2018 00:00 - 01:00 | 1300 | 0 | 0 | 0 |
| 26.09.2018 01:00 - 02:00 | 1300 | 0 | 0 | 0 |
| 26.09.2018 02:00 - 03:00 | 1798 | 0 | 0 | 0 |
| 26.09.2018 03:00 - 04:00 | 1798 | 0 | 0 | 0 |
| 26.09.2018 04:00 - 05:00 | 1798 | 0 | 0 | 0 |
| 26.09.2018 05:00 - 06:00 | 1798 | 0 | 0 | 0 |
| 26.09.2018 06:00 - 07:00 | 0 | 0 | 0 | 0 |
| 26.09.2018 07:00 - 08:00 | 0 | 0 | 0 | 0 |
| 26.09.2018 08:00 - 09:00 | 0 | 0 | 0 | 0 |
| 26.09.2018 09:00 - 10:00 | 0 | 0 | 0 | 0 |
| 26.09.2018 10:00 - 11:00 | 0 | 0 | 0 | 0 |
| 26.09.2018 11:00 - 12:00 | 0 | 0 | 0 | 0 |
| 26.09.2018 12:00 - 13:00 | 300 | 0 | 0 | 0 |
| 26.09.2018 13:00 - 14:00 | 300 | 0 | 0 | 0 |
| 26.09.2018 14:00 - 15:00 | 600 | 0 | 0 | 0 |
| 26.09.2018 15:00 - 16:00 | 600 | 0 | 0 | 0 |
| 26.09.2018 16:00 - 17:00 | 600 | 0 | 0 | 0 |
| 26.09.2018 17:00 - 18:00 | 600 | 0 | 0 | 0 |
| 26.09.2018 18:00 - 19:00 | 600 | 0 | 0 | 0 |
| 26.09.2018 19:00 - 20:00 | 600 | 0 | 0 | 0 |
| 26.09.2018 20:00 - 21:00 | 600 | 0 | 0 | 0 |
| 26.09.2018 21:00 - 22:00 | 600 | 0 | 0 | 0 |
| 26.09.2018 22:00 - 23:00 | 1200 | 0 | 0 | 0 |
| 26.09.2018 23:00 - 24:00 | 1200 | 0 | 0 | 0 |
| 27.09.2018 00:00 - 01:00 | 1200 | 0 | 0 | 0 |
| 27.09.2018 01:00 - 02:00 | 1640 | 0 | 0 | 0 |
| 27.09.2018 02:00 - 03:00 | 1640 | 0 | 0 | 0 |
| 27.09.2018 03:00 - 04:00 | 1640 | 0 | 0 | 0 |
| 27.09.2018 04:00 - 05:00 | 1640 | 0 | 0 | 0 |
| 27.09.2018 05:00 - 06:00 | 1640 | 0 | 0 | 0 |
| 27.09.2018 06:00 - 07:00 | 0 | 0 | 0 | 0 |
| 27.09.2018 07:00 - 08:00 | 0 | 0 | 0 | 0 |
| 27.09.2018 08:00 - 09:00 | 0 | 0 | 0 | 0 |
| 27.09.2018 09:00 - 10:00 | 0 | 0 | 0 | 0 |
| 27.09.2018 10:00 - 11:00 | 0 | 0 | 0 | 0 |
| 27.09.2018 11:00 - 12:00 | 0 | 0 | 0 | 0 |
| 27.09.2018 12:00 - 13:00 | 0 | 0 | 0 | 0 |
| 27.09.2018 13:00 - 14:00 | 0 | 0 | 0 | 0 |
| 27.09.2018 14:00 - 15:00 | 0 | 0 | 0 | 0 |
| 27.09.2018 15:00 - 16:00 | 0 | 0 | 0 | 0 |
| 27.09.2018 16:00 - 17:00 | 0 | 0 | 0 | 0 |
| 27.09.2018 17:00 - 18:00 | 0 | 0 | 0 | 0 |
| 27.09.2018 18:00 - 19:00 | 0 | 0 | 0 | 0 |
| 27.09.2018 19:00 - 20:00 | 0 | 0 | 0 | 0 |
| 27.09.2018 20:00 - 21:00 | 0 | 0 | 0 | 0 |
| 27.09.2018 21:00 - 22:00 | 0 | 0 | 0 | 0 |
| 27.09.2018 22:00 - 23:00 | 0 | 0 | 0 | 0 |
| 27.09.2018 23:00 - 24:00 | 500 | 0 | 0 | 0 |
| 28.09.2018 00:00 - 01:00 | 500 | 0 | 0 | 0 |
| 28.09.2018 01:00 - 02:00 | 500 | 0 | 0 | 0 |
| 28.09.2018 02:00 - 03:00 | 500 | 0 | 0 | 0 |
| 28.09.2018 03:00 - 04:00 | 500 | 0 | 0 | 0 |
| 28.09.2018 04:00 - 05:00 | 500 | 0 | 0 | 0 |
| 28.09.2018 05:00 - 06:00 | 500 | 0 | 0 | 0 |
| 28.09.2018 06:00 - 07:00 | 0 | 0 | 0 | 0 |
| 28.09.2018 07:00 - 08:00 | 0 | 0 | 0 | 0 |
| 28.09.2018 08:00 - 09:00 | 0 | 0 | 0 | 0 |
| 28.09.2018 09:00 - 10:00 | 0 | 0 | 0 | 0 |
| 28.09.2018 10:00 - 11:00 | 0 | 0 | 0 | 0 |
| 28.09.2018 11:00 - 12:00 | 0 | 0 | 0 | 0 |
| 28.09.2018 12:00 - 13:00 | 0 | 0 | 0 | 0 |
| 28.09.2018 13:00 - 14:00 | 0 | 0 | 0 | 0 |
| 28.09.2018 14:00 - 15:00 | 0 | 0 | 0 | 0 |
| 28.09.2018 15:00 - 16:00 | 0 | 0 | 0 | 0 |
| 28.09.2018 16:00 - 17:00 | 0 | 0 | 0 | 0 |
| 28.09.2018 17:00 - 18:00 | 0 | 0 | 0 | 0 |
| 28.09.2018 18:00 - 19:00 | 0 | 0 | 0 | 0 |
| 28.09.2018 19:00 - 20:00 | 0 | 0 | 0 | 0 |
| 28.09.2018 20:00 - 21:00 | 0 | 0 | 0 | 0 |
| 28.09.2018 21:00 - 22:00 | 0 | 0 | 0 | 0 |
| 28.09.2018 22:00 - 23:00 | 0 | 0 | 0 | 0 |
| 28.09.2018 23:00 - 24:00 | 0 | 0 | 0 | 0 |
| 29.09.2018 00:00 - 01:00 | 0 | 0 | 0 | 0 |
| 29.09.2018 01:00 - 02:00 | 0 | 0 | 0 | 0 |
| 29.09.2018 02:00 - 03:00 | 0 | 0 | 0 | 0 |
| 29.09.2018 03:00 - 04:00 | 0 | 0 | 0 | 0 |
| 29.09.2018 04:00 - 05:00 | 0 | 0 | 0 | 0 |
| 29.09.2018 05:00 - 06:00 | 0 | 0 | 0 | 0 |
| 29.09.2018 06:00 - 07:00 | 0 | 0 | 0 | 0 |
| 29.09.2018 07:00 - 08:00 | 0 | 0 | 0 | 0 |
| 29.09.2018 08:00 - 09:00 | 0 | 0 | 0 | 0 |
| 29.09.2018 09:00 - 10:00 | 0 | 0 | 0 | 0 |
| 29.09.2018 10:00 - 11:00 | 0 | 0 | 0 | 0 |
| 29.09.2018 11:00 - 12:00 | 0 | 0 | 0 | 0 |
| 29.09.2018 12:00 - 13:00 | 0 | 0 | 0 | 0 |
| 29.09.2018 13:00 - 14:00 | 0 | 0 | 0 | 0 |
| 29.09.2018 14:00 - 15:00 | 0 | 0 | 0 | 0 |
| 29.09.2018 15:00 - 16:00 | 0 | 0 | 0 | 0 |
| 29.09.2018 16:00 - 17:00 | 0 | 0 | 0 | 0 |
| 29.09.2018 17:00 - 18:00 | 0 | 0 | 0 | 0 |
| 29.09.2018 18:00 - 19:00 | 0 | 0 | 0 | 0 |
| 29.09.2018 19:00 - 20:00 | 0 | 0 | 0 | 0 |
| 29.09.2018 20:00 - 21:00 | 0 | 0 | 0 | 0 |
| 29.09.2018 21:00 - 22:00 | 0 | 0 | 0 | 0 |
| 29.09.2018 22:00 - 23:00 | 0 | 0 | 0 | 0 |
| 29.09.2018 23:00 - 24:00 | 0 | 0 | 0 | 0 |
| 30.09.2018 00:00 - 01:00 | 0 | 0 | 0 | 0 |
| 30.09.2018 01:00 - 02:00 | 0 | 0 | 0 | 0 |
| 30.09.2018 02:00 - 03:00 | 0 | 0 | 0 | 0 |
| 30.09.2018 03:00 - 04:00 | 0 | 0 | 0 | 0 |
| 30.09.2018 04:00 - 05:00 | 0 | 0 | 0 | 0 |
| 30.09.2018 05:00 - 06:00 | 0 | 0 | 0 | 0 |
| 30.09.2018 06:00 - 07:00 | 0 | 0 | 0 | 0 |
| 30.09.2018 07:00 - 08:00 | 0 | 0 | 0 | 0 |
| 30.09.2018 08:00 - 09:00 | 0 | 0 | 0 | 0 |
| 30.09.2018 09:00 - 10:00 | 0 | 0 | 0 | 0 |
| 30.09.2018 10:00 - 11:00 | 0 | 0 | 0 | 0 |
| 30.09.2018 11:00 - 12:00 | 0 | 0 | 0 | 0 |
| 30.09.2018 12:00 - 13:00 | 0 | 0 | 0 | 0 |
| 30.09.2018 13:00 - 14:00 | 0 | 0 | 0 | 0 |
| 30.09.2018 14:00 - 15:00 | 0 | 0 | 0 | 0 |
| 30.09.2018 15:00 - 16:00 | 0 | 0 | 0 | 0 |
| 30.09.2018 16:00 - 17:00 | 0 | 0 | 0 | 0 |
| 30.09.2018 17:00 - 18:00 | 0 | 0 | 0 | 0 |
| 30.09.2018 18:00 - 19:00 | 0 | 0 | 0 | 0 |
| 30.09.2018 19:00 - 20:00 | 0 | 0 | 0 | 0 |
| 30.09.2018 20:00 - 21:00 | 0 | 0 | 0 | 0 |
| 30.09.2018 21:00 - 22:00 | 0 | 0 | 0 | 0 |
| 30.09.2018 22:00 - 23:00 | 0 | 0 | 0 | 0 |
| 30.09.2018 23:00 - 24:00 | 0 | -400 | 0 | 0 |
| 01.10.2018 00:00 - 01:00 | 0 | -400 | 0 | 0 |
| 01.10.2018 01:00 - 02:00 | 0 | -400 | 0 | 0 |
| 01.10.2018 02:00 - 03:00 | 0 | -400 | 0 | 0 |
| 01.10.2018 03:00 - 04:00 | 0 | -400 | 0 | 0 |
| 01.10.2018 04:00 - 05:00 | 0 | -400 | 0 | 0 |
| 01.10.2018 05:00 - 06:00 | 0 | -400 | 0 | 0 |